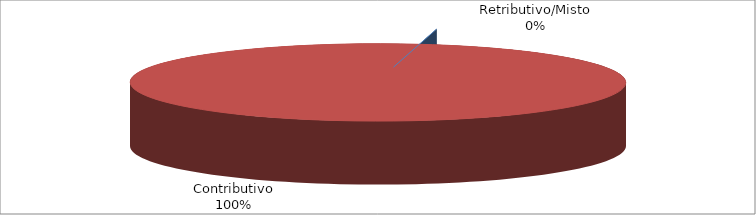
| Category | Decorrenti gennaio - marzo 2023 |
|---|---|
| Retributivo/Misto | 0 |
| Contributivo | 9752 |